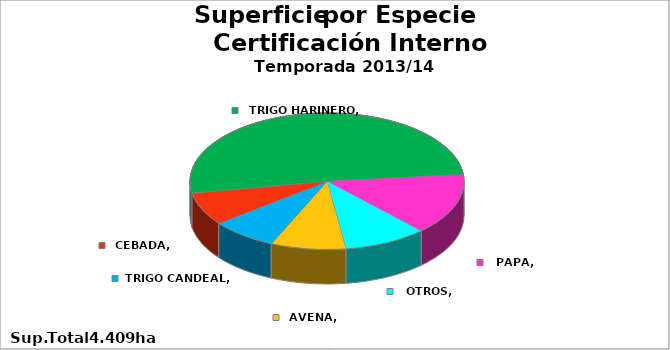
| Category | Series 0 |
|---|---|
| TRIGO HARINERO | 2256 |
| PAPA | 642 |
| OTROS | 434 |
| AVENA | 391 |
| TRIGO CANDEAL | 344 |
| CEBADA | 342 |